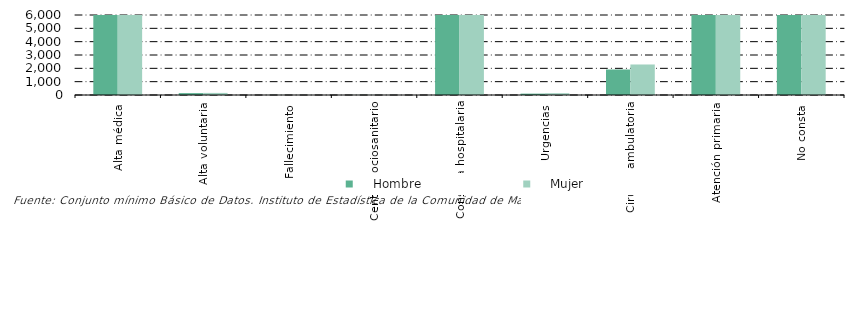
| Category |     Hombre |     Mujer |
|---|---|---|
| Alta médica | 399448 | 470568 |
| Alta voluntaria | 142 | 157 |
| Fallecimiento | 4 | 4 |
| Centro sociosanitario | 6 | 6 |
| Consulta hospitalaria | 71212 | 83130 |
| Urgencias | 103 | 136 |
| Cirugía ambulatoria | 1913 | 2289 |
| Atención primaria | 9769 | 12339 |
| No consta | 59304 | 83009 |